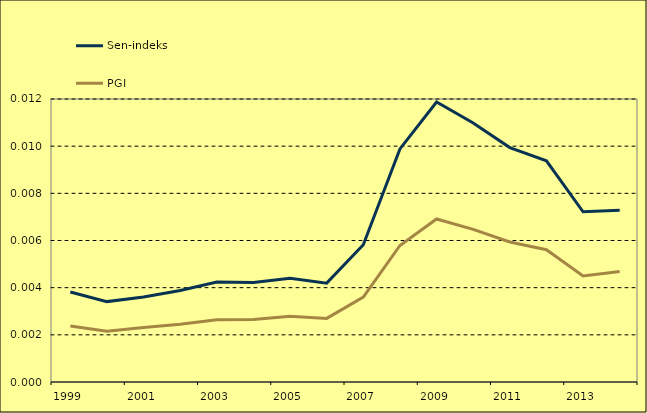
| Category | Sen-indeks | PGI |
|---|---|---|
| 1999.0 | 0.004 | 0.002 |
| 2000.0 | 0.003 | 0.002 |
| 2001.0 | 0.004 | 0.002 |
| 2002.0 | 0.004 | 0.002 |
| 2003.0 | 0.004 | 0.003 |
| 2004.0 | 0.004 | 0.003 |
| 2005.0 | 0.004 | 0.003 |
| 2006.0 | 0.004 | 0.003 |
| 2007.0 | 0.006 | 0.004 |
| 2008.0 | 0.01 | 0.006 |
| 2009.0 | 0.012 | 0.007 |
| 2010.0 | 0.011 | 0.006 |
| 2011.0 | 0.01 | 0.006 |
| 2012.0 | 0.009 | 0.006 |
| 2013.0 | 0.007 | 0.004 |
| 2014.0 | 0.007 | 0.005 |